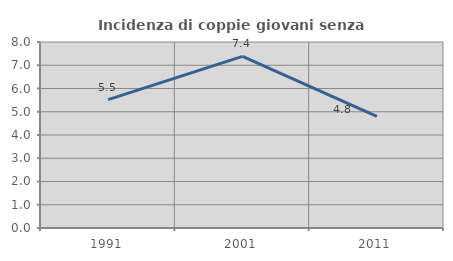
| Category | Incidenza di coppie giovani senza figli |
|---|---|
| 1991.0 | 5.523 |
| 2001.0 | 7.38 |
| 2011.0 | 4.801 |